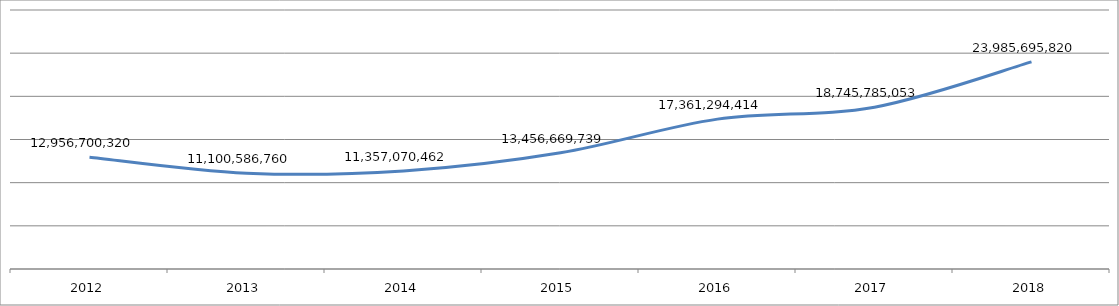
| Category | Series 0 |
|---|---|
| 2012 | 12956700320 |
| 2013 | 11100586760 |
| 2014 | 11357070462 |
| 2015 | 13456669739 |
| 2016 | 17361294414 |
| 2017 | 18745785053 |
| 2018 | 23985695820 |